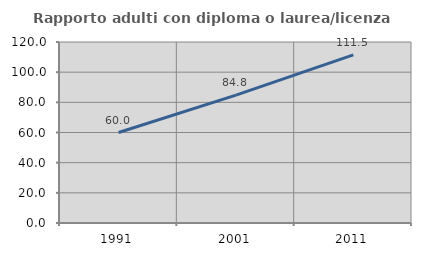
| Category | Rapporto adulti con diploma o laurea/licenza media  |
|---|---|
| 1991.0 | 60 |
| 2001.0 | 84.766 |
| 2011.0 | 111.45 |